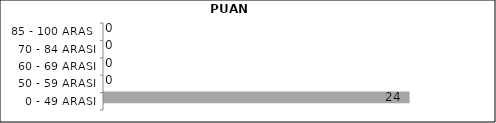
| Category | Series 0 | Series 1 | Series 2 |
|---|---|---|---|
| 0 - 49 ARASI |  |  | 24 |
| 50 - 59 ARASI |  |  | 0 |
| 60 - 69 ARASI |  |  | 0 |
| 70 - 84 ARASI |  |  | 0 |
| 85 - 100 ARASI |  |  | 0 |